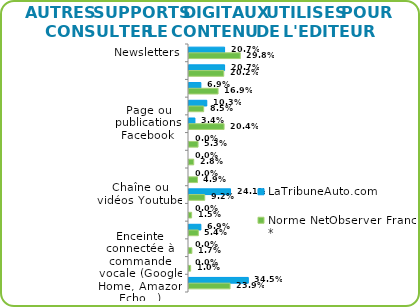
| Category | LaTribuneAuto.com | Norme NetObserver France * |
|---|---|---|
| Newsletters | 0.207 | 0.298 |
| Site mobile | 0.207 | 0.202 |
| Application sur mobile | 0.069 | 0.169 |
| Application sur tablette tactile | 0.103 | 0.085 |
| Page ou publications Facebook | 0.034 | 0.204 |
| Compte ou publications Instagram | 0 | 0.053 |
| Compte ou publications Pinterest | 0 | 0.028 |
| Compte ou publications Twitter | 0 | 0.049 |
| Chaîne ou vidéos Youtube | 0.241 | 0.092 |
| Compte ou publications Snapchat | 0 | 0.015 |
| Application de messagerie instantanée (Facebook Messenger, WhatsApp, …) | 0.069 | 0.054 |
| Podcasts | 0 | 0.017 |
| Enceinte connectée à commande vocale (Google Home, Amazon Echo…) | 0 | 0.01 |
| Aucun de ces supports | 0.345 | 0.239 |